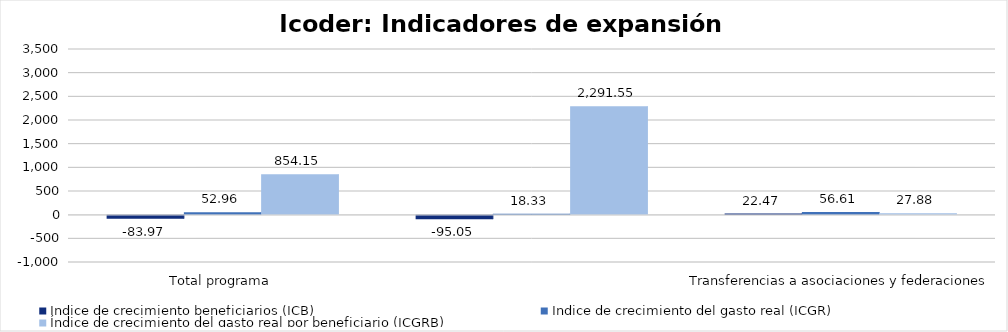
| Category | Índice de crecimiento beneficiarios (ICB)  | Índice de crecimiento del gasto real (ICGR)  | Índice de crecimiento del gasto real por beneficiario (ICGRB)  |
|---|---|---|---|
| Total programa | -83.969 | 52.959 | 854.147 |
| Transferencias a asociaciones y federaciones deportivas | -95.052 | 18.327 | 2291.55 |
| Servicio de uso de parques e instalaciones deportivas | 22.468 | 56.612 | 27.88 |